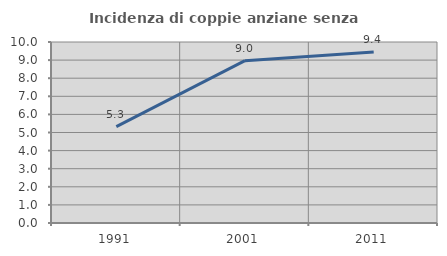
| Category | Incidenza di coppie anziane senza figli  |
|---|---|
| 1991.0 | 5.325 |
| 2001.0 | 8.968 |
| 2011.0 | 9.45 |